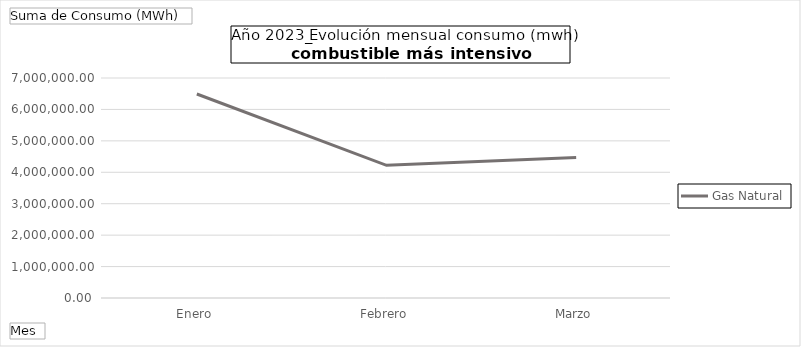
| Category | Gas Natural |
|---|---|
| Enero | 6491613.787 |
| Febrero | 4222741.03 |
| Marzo | 4471293.15 |